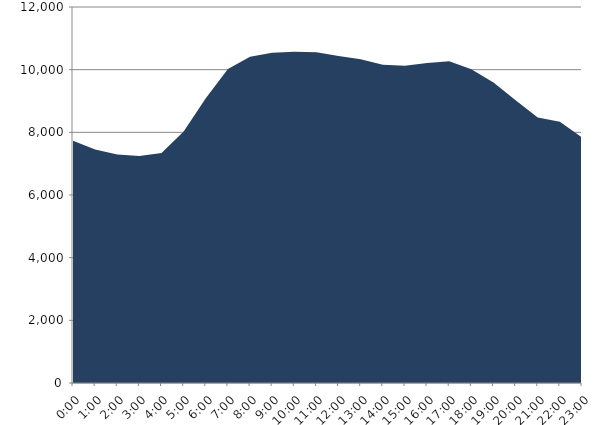
| Category | Series 0 | Series 1 |
|---|---|---|
| 2022-12-21 |  | 7730.486 |
| 2022-12-21 01:00:00 |  | 7448.149 |
| 2022-12-21 02:00:00 |  | 7293.612 |
| 2022-12-21 03:00:00 |  | 7240.991 |
| 2022-12-21 04:00:00 |  | 7339.689 |
| 2022-12-21 05:00:00 |  | 8027.295 |
| 2022-12-21 06:00:00 |  | 9088.942 |
| 2022-12-21 07:00:00 |  | 10017.722 |
| 2022-12-21 08:00:00 |  | 10412.49 |
| 2022-12-21 09:00:00 |  | 10539.358 |
| 2022-12-21 10:00:00 |  | 10569.597 |
| 2022-12-21 11:00:00 |  | 10556.595 |
| 2022-12-21 12:00:00 |  | 10439.748 |
| 2022-12-21 13:00:00 |  | 10332.907 |
| 2022-12-21 14:00:00 |  | 10153.947 |
| 2022-12-21 15:00:00 |  | 10126.413 |
| 2022-12-21 16:00:00 |  | 10214.23 |
| 2022-12-21 17:00:00 |  | 10266.529 |
| 2022-12-21 18:00:00 |  | 10011.184 |
| 2022-12-21 19:00:00 |  | 9589.446 |
| 2022-12-21 20:00:00 |  | 9025.214 |
| 2022-12-21 21:00:00 |  | 8475.576 |
| 2022-12-21 22:00:00 |  | 8338.941 |
| 2022-12-21 23:00:00 |  | 7840.043 |